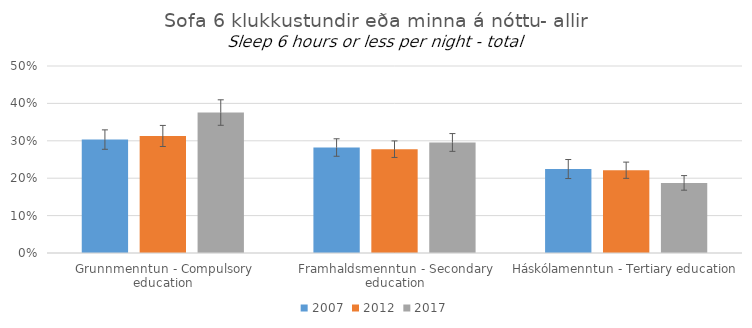
| Category | 2007 | 2012 | 2017 |
|---|---|---|---|
| Grunnmenntun - Compulsory education | 0.303 | 0.313 | 0.376 |
| Framhaldsmenntun - Secondary education | 0.282 | 0.278 | 0.296 |
| Háskólamenntun - Tertiary education | 0.224 | 0.221 | 0.187 |